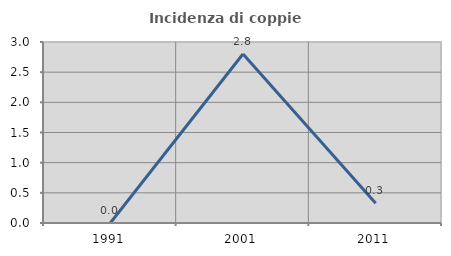
| Category | Incidenza di coppie miste |
|---|---|
| 1991.0 | 0 |
| 2001.0 | 2.801 |
| 2011.0 | 0.329 |